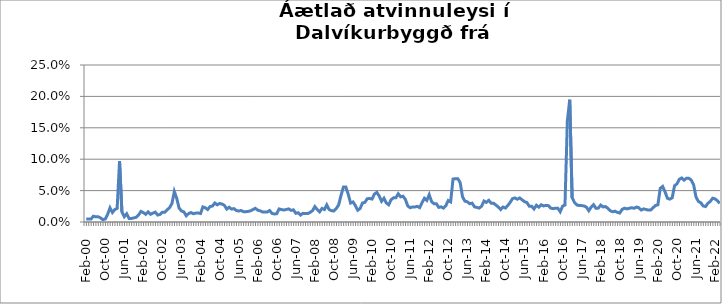
| Category | Series 0 |
|---|---|
| feb.00 | 0.005 |
| mar.00 | 0.005 |
| apr.00 | 0.005 |
| maí.00 | 0.009 |
| jún.00 | 0.008 |
| júl.00 | 0.008 |
| ágú.00 | 0.007 |
| sep.00 | 0.004 |
| okt.00 | 0.005 |
| nóv.00 | 0.012 |
| des.00 | 0.023 |
| jan.01 | 0.015 |
| feb.01 | 0.02 |
| mar.01 | 0.022 |
| apr.01 | 0.097 |
| maí.01 | 0.016 |
| jún.01 | 0.008 |
| júl.01 | 0.013 |
| ágú.01 | 0.006 |
| sep.01 | 0.006 |
| okt.01 | 0.007 |
| nóv.01 | 0.007 |
| des.01 | 0.011 |
| jan.02 | 0.017 |
| feb.02 | 0.015 |
| mar.02 | 0.012 |
| apr.02 | 0.016 |
| maí.02 | 0.012 |
| jún.02 | 0.014 |
| júl.02 | 0.016 |
| ágú.02 | 0.011 |
| sep.02 | 0.012 |
| okt.02 | 0.016 |
| nóv.02 | 0.016 |
| des.02 | 0.019 |
| jan.03 | 0.023 |
| feb.03 | 0.029 |
| mar.03 | 0.049 |
| apr.03 | 0.038 |
| maí.03 | 0.022 |
| jún.03 | 0.018 |
| júl.03 | 0.016 |
| ágú.03 | 0.01 |
| sep.03 | 0.013 |
| okt.03 | 0.015 |
| nóv.03 | 0.013 |
| des.03 | 0.014 |
| jan.04 | 0.014 |
| feb.04 | 0.013 |
| mar.04 | 0.024 |
| apr.04 | 0.023 |
| maí.04 | 0.02 |
| jún.04 | 0.025 |
| júl.04 | 0.025 |
| ágú.04 | 0.03 |
| sep.04 | 0.027 |
| okt.04 | 0.03 |
| nóv.04 | 0.029 |
| des.04 | 0.027 |
| jan.05 | 0.021 |
| feb.05 | 0.024 |
| mar.05 | 0.021 |
| apr.05 | 0.021 |
| maí.05 | 0.018 |
| jún.05 | 0.017 |
| júl.05 | 0.018 |
| ágú.05 | 0.016 |
| sep.05 | 0.016 |
| okt.05 | 0.017 |
| nóv.05 | 0.018 |
| des.05 | 0.02 |
| jan.06 | 0.022 |
| feb.06 | 0.019 |
| mar.06 | 0.018 |
| apr.06 | 0.016 |
| maí.06 | 0.016 |
| jún.06 | 0.016 |
| júl.06 | 0.018 |
| ágú.06 | 0.014 |
| sep.06 | 0.013 |
| okt.06 | 0.013 |
| nóv.06 | 0.021 |
| des.06 | 0.02 |
| jan.07 | 0.019 |
| feb.07 | 0.02 |
| mar.07 | 0.021 |
| apr.07 | 0.018 |
| maí.07 | 0.019 |
| jún.07 | 0.014 |
| júl.07 | 0.015 |
| ágú.07 | 0.011 |
| sep.07 | 0.014 |
| okt.07 | 0.013 |
| nóv.07 | 0.013 |
| des.07 | 0.015 |
| jan.08 | 0.018 |
| feb.08 | 0.025 |
| mar.08 | 0.02 |
| apr.08 | 0.016 |
| maí.08 | 0.022 |
| jún.08 | 0.02 |
| júl.08 | 0.027 |
| ágú.08 | 0.02 |
| sep.08 | 0.018 |
| okt.08 | 0.018 |
| nóv.08 | 0.022 |
| des.08 | 0.027 |
| jan.09 | 0.043 |
| feb.09 | 0.056 |
| mar.09 | 0.056 |
| apr.09 | 0.044 |
| maí.09 | 0.03 |
| jún.09 | 0.032 |
| júl.09 | 0.026 |
| ágú.09 | 0.019 |
| sep.09 | 0.022 |
| okt.09 | 0.03 |
| nóv.09 | 0.031 |
| des.09 | 0.037 |
| jan.10 | 0.038 |
| feb.10 | 0.037 |
| mar.10 | 0.044 |
| apr.10 | 0.047 |
| maí.10 | 0.041 |
| jún.10 | 0.033 |
| júl.10 | 0.038 |
| ágú.10 | 0.03 |
| sep.10 | 0.027 |
| okt.10 | 0.036 |
| nóv.10 | 0.038 |
| des.10 | 0.038 |
| jan.11 | 0.045 |
| feb.11 | 0.04 |
| mar.11 | 0.041 |
| apr.11 | 0.036 |
| maí.11 | 0.026 |
| jún.11 | 0.023 |
| júl.11 | 0.024 |
| ágú.11 | 0.024 |
| sep.11 | 0.025 |
| okt.11 | 0.023 |
| nóv.11 | 0.031 |
| des.11 | 0.038 |
| jan.12 | 0.034 |
| feb.12 | 0.044 |
| mar.12 | 0.032 |
| apr.12 | 0.029 |
| maí.12 | 0.029 |
| jún.12 | 0.023 |
| júl.12 | 0.024 |
| ágú.12 | 0.022 |
| sep.12 | 0.026 |
| okt.12 | 0.034 |
| nóv.12 | 0.032 |
| des.12 | 0.068 |
| jan.13 | 0.069 |
| feb.13 | 0.069 |
| mar.13 | 0.063 |
| apr.13 | 0.04 |
| maí.13 | 0.033 |
| jún.13 | 0.032 |
| júl.13 | 0.029 |
| ágú.13 | 0.03 |
| sep.13 | 0.024 |
| okt.13 | 0.023 |
| nóv.13 | 0.022 |
| des.13 | 0.025 |
| jan.14 | 0.033 |
| feb.14 | 0.031 |
| mar.14 | 0.034 |
| apr.14 | 0.03 |
| maí.14 | 0.03 |
| jún.14 | 0.027 |
| júl.14 | 0.024 |
| ágú.14 | 0.02 |
| sep.14 | 0.024 |
| okt.14 | 0.022 |
| nóv.14 | 0.026 |
| des.14 | 0.031 |
| jan.15 | 0.037 |
| feb.15 | 0.038 |
| mar.15 | 0.036 |
| apr.15 | 0.038 |
| maí.15 | 0.035 |
| jún.15 | 0.032 |
| júl.15 | 0.031 |
| ágú.15 | 0.025 |
| sep.15 | 0.025 |
| okt.15 | 0.021 |
| nóv.15 | 0.027 |
| des.15 | 0.024 |
| jan.16 | 0.028 |
| feb.16 | 0.026 |
| mar.16 | 0.027 |
| apr.16 | 0.026 |
| maí.16 | 0.022 |
| jún.16 | 0.021 |
| júl.16 | 0.022 |
| ágú.16 | 0.022 |
| sep.16 | 0.016 |
| okt.16 | 0.025 |
| nóv.16 | 0.027 |
| des.16 | 0.161 |
| jan.17 | 0.195 |
| feb.17 | 0.039 |
| mar.17 | 0.031 |
| apr.17 | 0.027 |
| maí.17 | 0.026 |
| jún.17 | 0.026 |
| júl.17 | 0.025 |
| ágú.17 | 0.024 |
| sep.17 | 0.018 |
| okt.17 | 0.024 |
| nóv.17 | 0.028 |
| des.17 | 0.022 |
| jan.18 | 0.022 |
| feb.18 | 0.027 |
| mar.18 | 0.024 |
| apr.18 | 0.025 |
| maí.18 | 0.022 |
| jún.18 | 0.018 |
| júl.18 | 0.016 |
| ágú.18 | 0.017 |
| sep.18 | 0.015 |
| okt.18 | 0.014 |
| nóv.18 | 0.02 |
| des.18 | 0.022 |
| jan.19 | 0.021 |
| feb.19 | 0.022 |
| mar.19 | 0.023 |
| apr.19 | 0.022 |
| maí.19 | 0.024 |
| jún.19 | 0.023 |
| júl.19 | 0.019 |
| ágú.19 | 0.021 |
| sep.19 | 0.02 |
| okt.19 | 0.019 |
| nóv.19 | 0.019 |
| des.19 | 0.023 |
| jan.20 | 0.026 |
| feb.20 | 0.027 |
| mar.2020* | 0.054 |
| apr.20 | 0.057 |
| maí.20 | 0.048 |
| jún.20 | 0.038 |
| júl.20 | 0.036 |
| ágú.20 | 0.038 |
| sep.20 | 0.058 |
| okt.20 | 0.061 |
| nóv.20 | 0.068 |
| des.20 | 0.07 |
| jan.21 | 0.067 |
| feb.21 | 0.07 |
| mar.21 | 0.07 |
| apr.21 | 0.067 |
| maí.21 | 0.059 |
| jún.21 | 0.04 |
| júl.21 | 0.033 |
| ágú.21 | 0.031 |
| sep.21 | 0.026 |
| okt.21 | 0.025 |
| nóv.21 | 0.03 |
| des.21 | 0.033 |
| jan.22 | 0.038 |
| feb.22 | 0.037 |
| mar.22 | 0.034 |
| apr.22 | 0.03 |